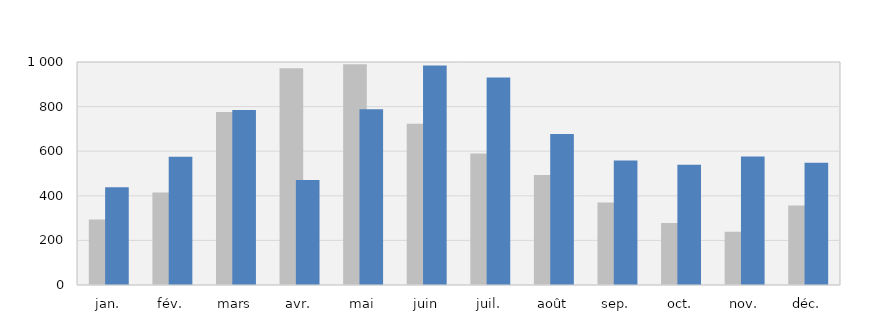
| Category | 2019 | 2020 |
|---|---|---|
| jan. | 294 | 438 |
| fév. | 415 | 575 |
| mars | 776 | 785 |
| avr. | 972 | 471 |
| mai | 990 | 788 |
| juin | 723 | 984 |
| juil. | 590 | 931 |
| août | 493 | 677 |
| sep. | 370 | 558 |
| oct. | 278 | 539 |
| nov. | 239 | 576 |
| déc. | 357 | 548 |